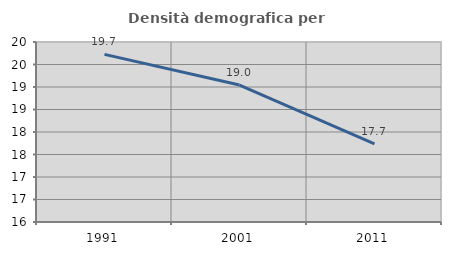
| Category | Densità demografica |
|---|---|
| 1991.0 | 19.726 |
| 2001.0 | 19.044 |
| 2011.0 | 17.736 |